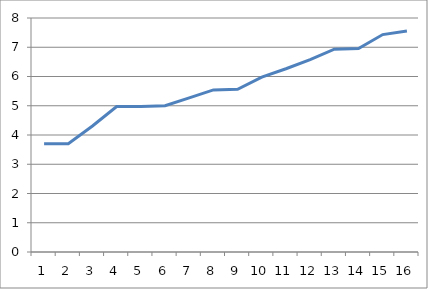
| Category | Duracio anys |
|---|---|
| 0 | 3.702 |
| 1 | 3.704 |
| 2 | 4.307 |
| 3 | 4.975 |
| 4 | 4.977 |
| 5 | 5.002 |
| 6 | 5.268 |
| 7 | 5.541 |
| 8 | 5.563 |
| 9 | 5.979 |
| 10 | 6.264 |
| 11 | 6.574 |
| 12 | 6.935 |
| 13 | 6.954 |
| 14 | 7.433 |
| 15 | 7.556 |